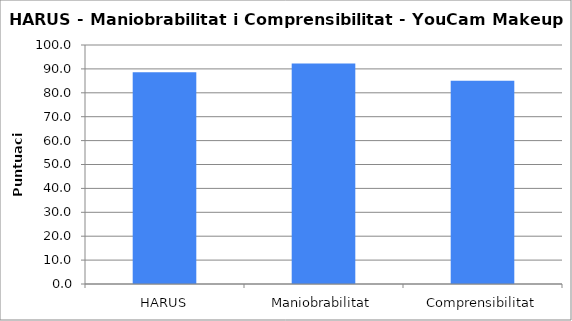
| Category | Series 0 |
|---|---|
| HARUS | 88.636 |
| Maniobrabilitat | 92.235 |
| Comprensibilitat | 85.038 |